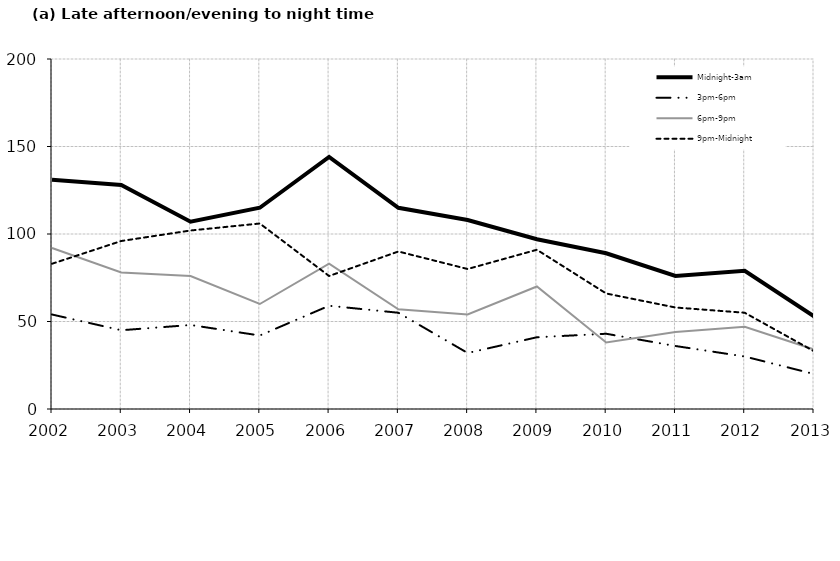
| Category | Midnight-3am | 3pm-6pm | 6pm-9pm | 9pm-Midnight |
|---|---|---|---|---|
| 2002.0 | 131 | 54 | 92 | 83 |
| 2003.0 | 128 | 45 | 78 | 96 |
| 2004.0 | 107 | 48 | 76 | 102 |
| 2005.0 | 115 | 42 | 60 | 106 |
| 2006.0 | 144 | 59 | 83 | 76 |
| 2007.0 | 115 | 55 | 57 | 90 |
| 2008.0 | 108 | 32 | 54 | 80 |
| 2009.0 | 97 | 41 | 70 | 91 |
| 2010.0 | 89 | 43 | 38 | 66 |
| 2011.0 | 76 | 36 | 44 | 58 |
| 2012.0 | 79 | 30 | 47 | 55 |
| 2013.0 | 53 | 20 | 34 | 33 |